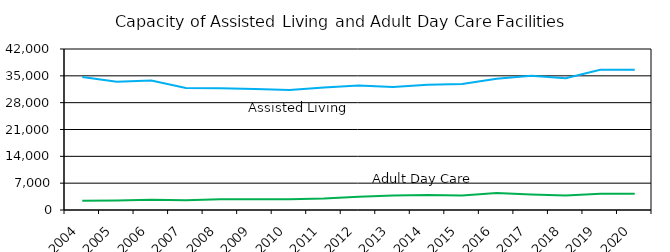
| Category | Assisted Living | Adult Day Care |
|---|---|---|
| 2004.0 | 34725 | 2410 |
| 2005.0 | 33460 | 2491 |
| 2006.0 | 33791 | 2665 |
| 2007.0 | 31824 | 2520 |
| 2008.0 | 31778 | 2820 |
| 2009.0 | 31545 | 2804 |
| 2010.0 | 31275 | 2823 |
| 2011.0 | 31964 | 3000 |
| 2012.0 | 32490 | 3449 |
| 2013.0 | 32091 | 3791 |
| 2014.0 | 32682 | 3928 |
| 2015.0 | 32860 | 3807 |
| 2016.0 | 34251 | 4438 |
| 2017.0 | 35051 | 4015 |
| 2018.0 | 34397 | 3786 |
| 2019.0 | 36578 | 4209 |
| 2020.0 | 36578 | 4209 |